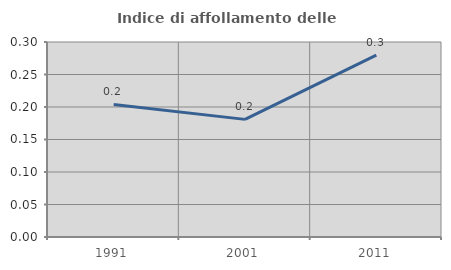
| Category | Indice di affollamento delle abitazioni  |
|---|---|
| 1991.0 | 0.204 |
| 2001.0 | 0.181 |
| 2011.0 | 0.28 |